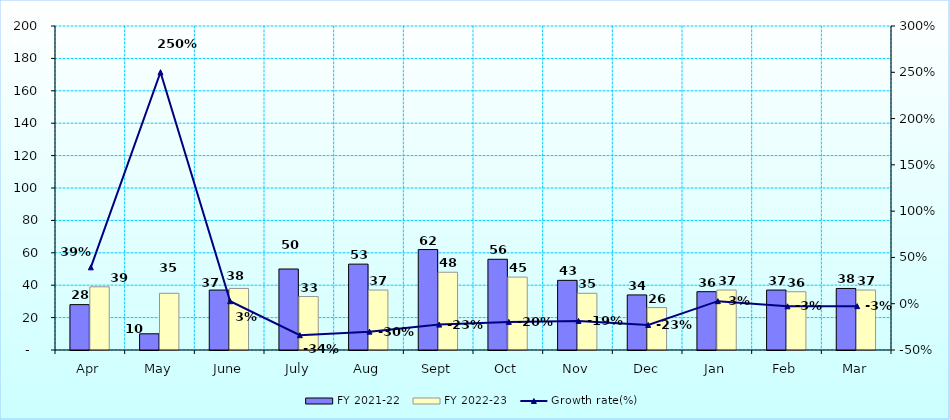
| Category | FY 2021-22 | FY 2022-23 |
|---|---|---|
| Apr | 28 | 39 |
| May | 10 | 35 |
| June | 37 | 38 |
| July | 50 | 33 |
| Aug | 53 | 37 |
| Sept | 62 | 48 |
| Oct | 56 | 45 |
| Nov | 43 | 35 |
| Dec | 34 | 26.195 |
| Jan | 36 | 37 |
| Feb | 37 | 35.958 |
| Mar | 38 | 37 |